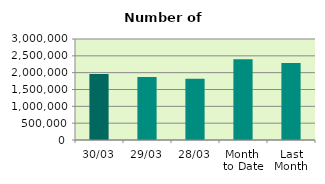
| Category | Series 0 |
|---|---|
| 30/03 | 1959578 |
| 29/03 | 1872414 |
| 28/03 | 1818212 |
| Month 
to Date | 2397422.818 |
| Last
Month | 2290810.7 |